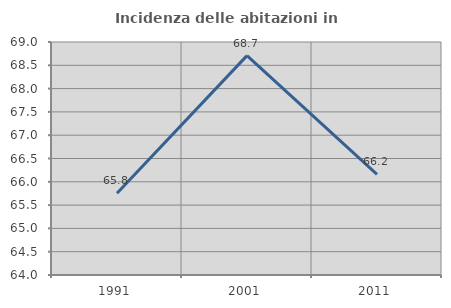
| Category | Incidenza delle abitazioni in proprietà  |
|---|---|
| 1991.0 | 65.753 |
| 2001.0 | 68.707 |
| 2011.0 | 66.161 |